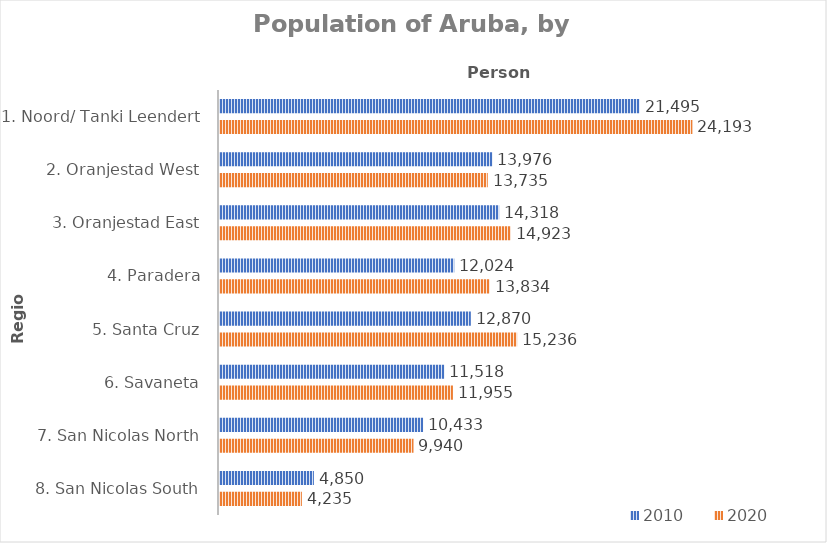
| Category | 2010 | 2020 |
|---|---|---|
| 1. Noord/ Tanki Leendert | 21495 | 24193 |
| 2. Oranjestad West | 13976 | 13735 |
| 3. Oranjestad East | 14318 | 14923 |
| 4. Paradera | 12024 | 13834 |
| 5. Santa Cruz | 12870 | 15236 |
| 6. Savaneta | 11518 | 11955 |
| 7. San Nicolas North | 10433 | 9940 |
| 8. San Nicolas South | 4850 | 4235 |